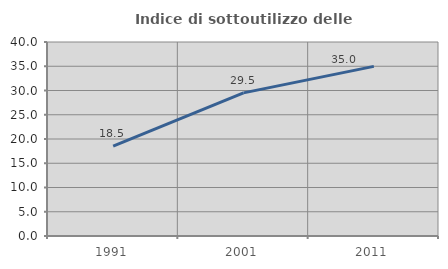
| Category | Indice di sottoutilizzo delle abitazioni  |
|---|---|
| 1991.0 | 18.515 |
| 2001.0 | 29.507 |
| 2011.0 | 34.974 |